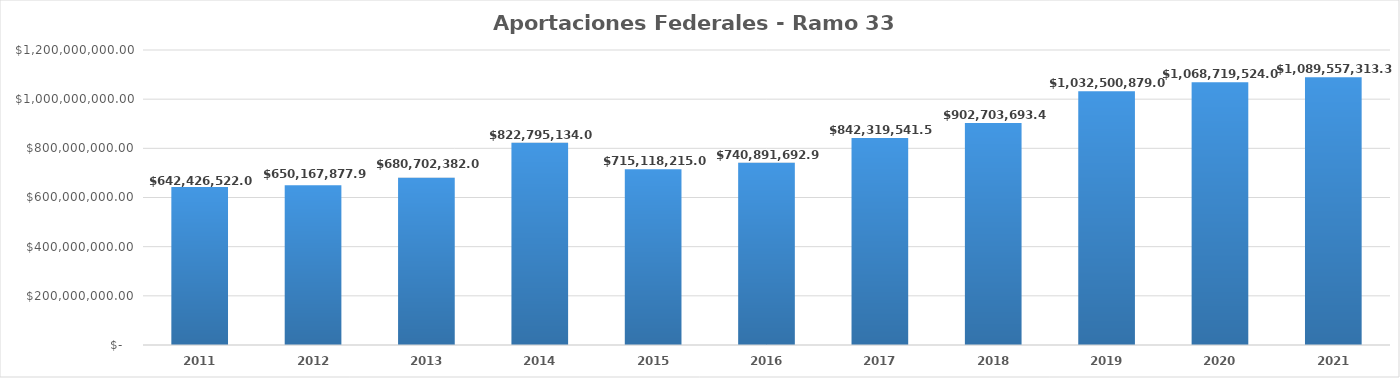
| Category | Aportaciones Federales - Ramo 33 FISM-FORTAMUN |
|---|---|
| 2011.0 | 642426522 |
| 2012.0 | 650167877.96 |
| 2013.0 | 680702382 |
| 2014.0 | 822795134 |
| 2015.0 | 715118215 |
| 2016.0 | 740891692.9 |
| 2017.0 | 842319541.5 |
| 2018.0 | 902703693.48 |
| 2019.0 | 1032500879 |
| 2020.0 | 1068719524 |
| 2021.0 | 1089557313.39 |